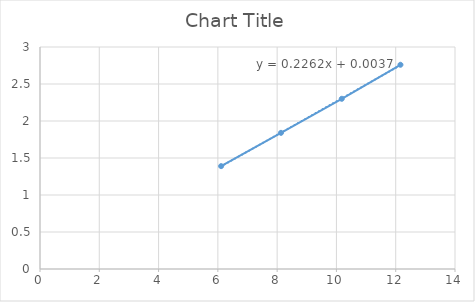
| Category | Series 0 |
|---|---|
| 6.11 | 1.39 |
| 8.13 | 1.84 |
| 10.18 | 2.3 |
| 12.16 | 2.76 |